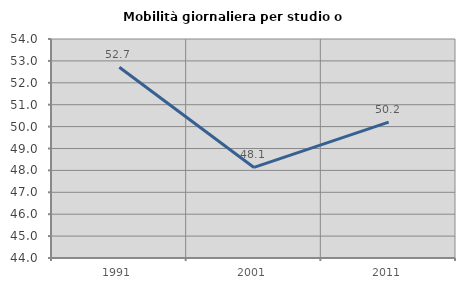
| Category | Mobilità giornaliera per studio o lavoro |
|---|---|
| 1991.0 | 52.709 |
| 2001.0 | 48.136 |
| 2011.0 | 50.205 |